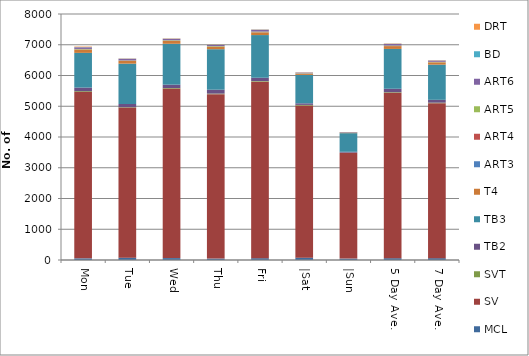
| Category | MCL | SV | SVT | TB2 | TB3 | T4 | ART3 | ART4 | ART5 | ART6 | BD | DRT |
|---|---|---|---|---|---|---|---|---|---|---|---|---|
| Mon | 53 | 5415 | 23 | 116 | 1129 | 106 | 2 | 5 | 15 | 53 | 6 | 18 |
| Tue | 76 | 4881 | 13 | 103 | 1312 | 88 | 0 | 9 | 10 | 51 | 6 | 7 |
| Wed | 62 | 5513 | 18 | 109 | 1329 | 96 | 1 | 2 | 16 | 47 | 6 | 9 |
| Thu | 46 | 5348 | 18 | 126 | 1317 | 80 | 0 | 2 | 17 | 40 | 8 | 8 |
| Fri | 59 | 5741 | 19 | 108 | 1388 | 86 | 2 | 6 | 19 | 59 | 7 | 7 |
| |Sat | 76 | 4946 | 22 | 51 | 924 | 38 | 1 | 1 | 12 | 24 | 3 | 7 |
| |Sun | 45 | 3437 | 8 | 29 | 606 | 15 | 0 | 0 | 8 | 15 | 1 | 1 |
| 5 Day Ave. | 59 | 5380 | 18 | 112 | 1295 | 91 | 1 | 5 | 15 | 50 | 7 | 10 |
| 7 Day Ave. | 60 | 5040 | 17 | 92 | 1144 | 73 | 1 | 4 | 14 | 41 | 5 | 8 |